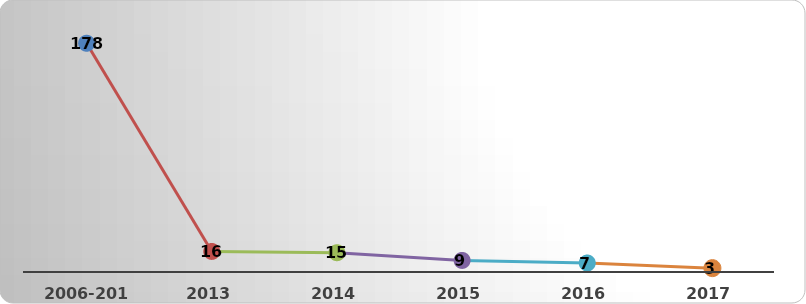
| Category | Total |
|---|---|
| 2006-2012 | 178 |
| 2013 | 16 |
| 2014 | 15 |
| 2015 | 9 |
| 2016 | 7 |
| 2017 | 3 |